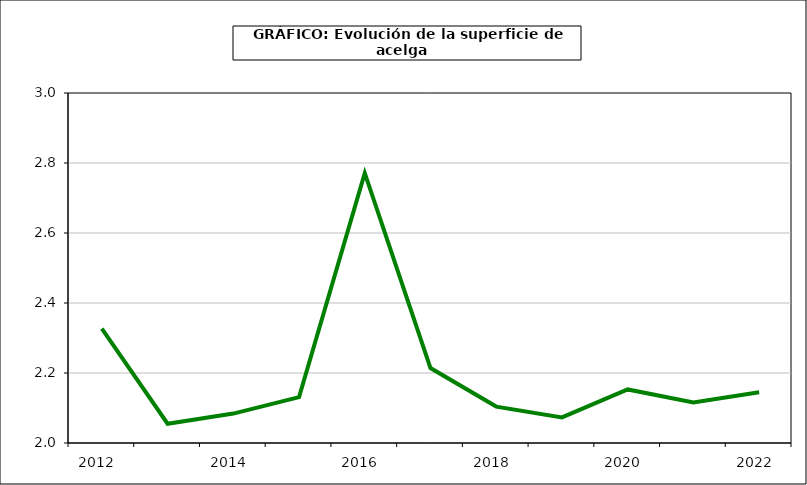
| Category | superficie |
|---|---|
| 2012.0 | 2.327 |
| 2013.0 | 2.055 |
| 2014.0 | 2.084 |
| 2015.0 | 2.131 |
| 2016.0 | 2.771 |
| 2017.0 | 2.214 |
| 2018.0 | 2.104 |
| 2019.0 | 2.073 |
| 2020.0 | 2.153 |
| 2021.0 | 2.116 |
| 2022.0 | 2.145 |